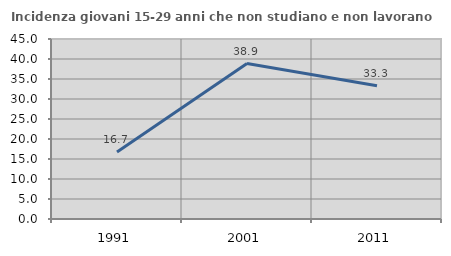
| Category | Incidenza giovani 15-29 anni che non studiano e non lavorano  |
|---|---|
| 1991.0 | 16.748 |
| 2001.0 | 38.86 |
| 2011.0 | 33.333 |